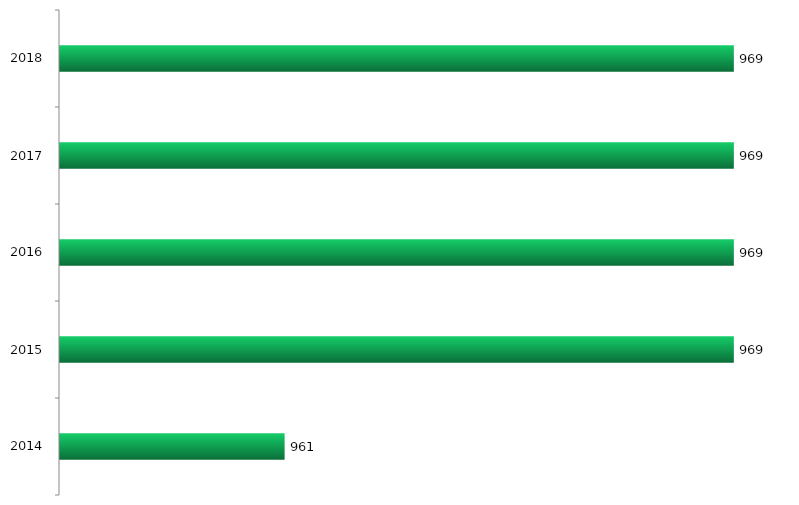
| Category | Vagas ofertadas |
|---|---|
| 2014.0 | 961 |
| 2015.0 | 969 |
| 2016.0 | 969 |
| 2017.0 | 969 |
| 2018.0 | 969 |